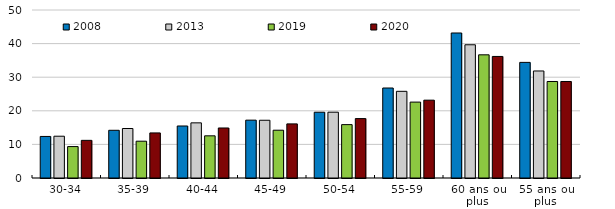
| Category | 2008 | 2013 | 2019 | 2020 |
|---|---|---|---|---|
| 30-34 | 12.366 | 12.436 | 9.356 | 11.207 |
| 35-39 | 14.199 | 14.731 | 10.954 | 13.415 |
| 40-44 | 15.48 | 16.412 | 12.554 | 14.887 |
| 45-49 | 17.217 | 17.185 | 14.221 | 16.104 |
| 50-54 | 19.575 | 19.586 | 15.886 | 17.682 |
| 55-59 | 26.782 | 25.797 | 22.587 | 23.168 |
| 60 ans ou plus | 43.157 | 39.651 | 36.661 | 36.178 |
| 55 ans ou plus | 34.409 | 31.852 | 28.723 | 28.723 |